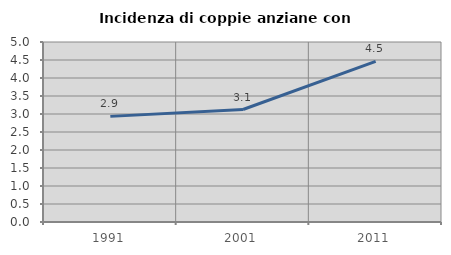
| Category | Incidenza di coppie anziane con figli |
|---|---|
| 1991.0 | 2.934 |
| 2001.0 | 3.125 |
| 2011.0 | 4.464 |